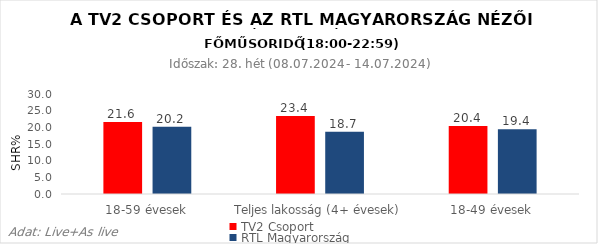
| Category | TV2 Csoport | RTL Magyarország |
|---|---|---|
| 18-59 évesek | 21.6 | 20.2 |
| Teljes lakosság (4+ évesek) | 23.4 | 18.7 |
| 18-49 évesek | 20.4 | 19.4 |